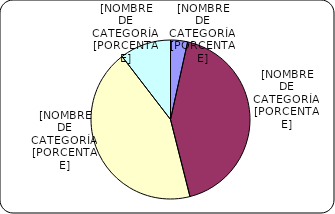
| Category | Series 0 |
|---|---|
| Menores de 3% | 426.7 |
| Entre 3% y 6% | 5241.5 |
| Entre 6% y 8% | 5354.1 |
| Entre 8% y 9% | 1284 |